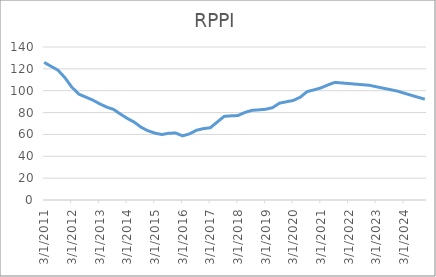
| Category | RPPI | GDP |
|---|---|---|
| 3/31/11 | 125.9 |  |
| 6/30/11 | 122.3 |  |
| 9/30/11 | 118.8 |  |
| 12/31/11 | 111.9 |  |
| 3/31/12 | 103.2 |  |
| 6/30/12 | 96.9 |  |
| 9/30/12 | 94.2 |  |
| 12/31/12 | 91.5 |  |
| 3/31/13 | 88.1 |  |
| 6/30/13 | 85.1 |  |
| 9/30/13 | 83 |  |
| 12/31/13 | 78.7 |  |
| 3/31/14 | 74.7 |  |
| 6/30/14 | 71.3 |  |
| 9/30/14 | 66.6 |  |
| 12/31/14 | 63.3 |  |
| 3/31/15 | 61.2 |  |
| 6/30/15 | 59.9 |  |
| 9/30/15 | 61.1 |  |
| 12/31/15 | 61.3 |  |
| 3/31/16 | 58.7 |  |
| 6/30/16 | 60.5 |  |
| 9/30/16 | 63.8 |  |
| 12/31/16 | 65.3 |  |
| 3/31/17 | 66.1 |  |
| 6/30/17 | 71.3 |  |
| 9/30/17 | 76.5 |  |
| 12/31/17 | 77 |  |
| 3/31/18 | 77.3 |  |
| 6/30/18 | 80.1 |  |
| 9/30/18 | 82 |  |
| 12/31/18 | 82.5 |  |
| 3/31/19 | 83 |  |
| 6/30/19 | 84.5 |  |
| 9/30/19 | 88.6 |  |
| 12/31/19 | 89.9 |  |
| 3/31/20 | 91.1 |  |
| 6/30/20 | 94.1 |  |
| 9/30/20 | 99.2 |  |
| 12/31/20 | 100.8 |  |
| 3/31/21 | 102.6 |  |
| 6/30/21 | 105.3 |  |
| 9/30/21 | 107.6 |  |
| 12/31/21 | 107.1 |  |
| 3/31/22 | 106.56 |  |
| 6/30/22 | 106.024 |  |
| 9/30/22 | 105.489 |  |
| 12/31/22 | 104.958 |  |
| 3/31/23 | 103.621 |  |
| 6/30/23 | 102.3 |  |
| 9/30/23 | 100.997 |  |
| 12/31/23 | 99.71 |  |
| 3/31/24 | 97.786 |  |
| 6/30/24 | 95.898 |  |
| 9/30/24 | 94.047 |  |
| 12/31/24 | 92.232 |  |